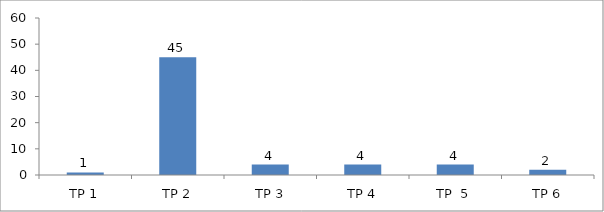
| Category | BIL. MURID |
|---|---|
| TP 1 | 1 |
| TP 2 | 45 |
|  TP 3 | 4 |
| TP 4 | 4 |
| TP  5 | 4 |
| TP 6 | 2 |